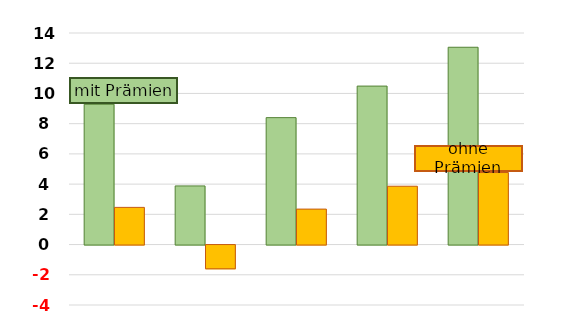
| Category | Stundenlohn 5 Jahre | Stundenlohn nach Änderung |
|---|---|---|
| BY Ø 53 K | 9.284 | 2.46 |
| 19 Kühe | 3.88 | -1.572 |
| 39 Kühe | 8.399 | 2.346 |
| 60 Kühe | 10.487 | 3.859 |
| 93 Kühe | 13.057 | 4.766 |